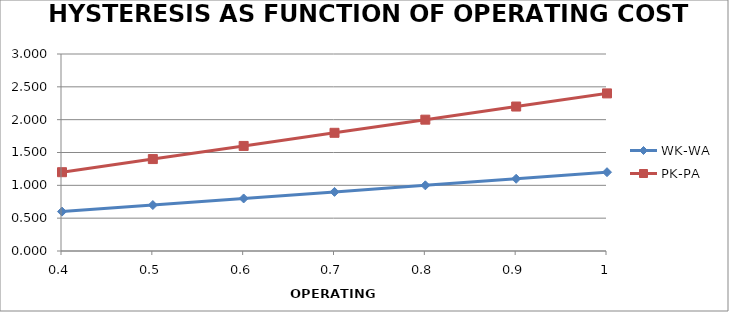
| Category | WK-WA | PK-PA |
|---|---|---|
| 0.40000000000000013 | 0.6 | 1.2 |
| 0.5000000000000001 | 0.7 | 1.4 |
| 0.6000000000000001 | 0.8 | 1.6 |
| 0.7000000000000001 | 0.9 | 1.8 |
| 0.8 | 1 | 2 |
| 0.9 | 1.1 | 2.2 |
| 1.0 | 1.2 | 2.4 |